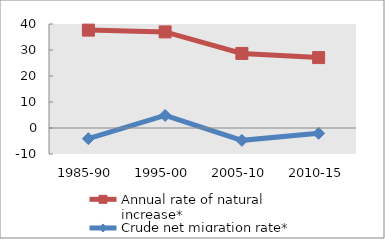
| Category | Annual rate of natural increase* | Crude net migration rate* |
|---|---|---|
| 1985-90 | 37.648 | -4.098 |
| 1995-00 | 36.959 | 4.825 |
| 2005-10 | 28.683 | -4.754 |
| 2010-15 | 27.082 | -2.044 |